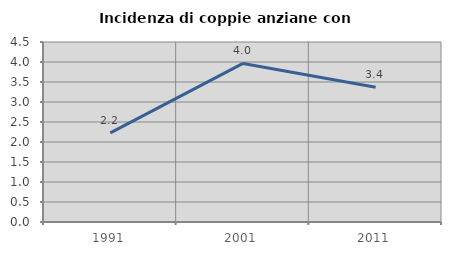
| Category | Incidenza di coppie anziane con figli |
|---|---|
| 1991.0 | 2.227 |
| 2001.0 | 3.965 |
| 2011.0 | 3.368 |